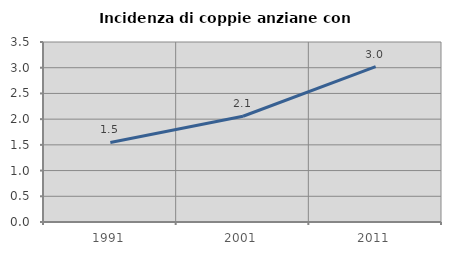
| Category | Incidenza di coppie anziane con figli |
|---|---|
| 1991.0 | 1.546 |
| 2001.0 | 2.056 |
| 2011.0 | 3.02 |